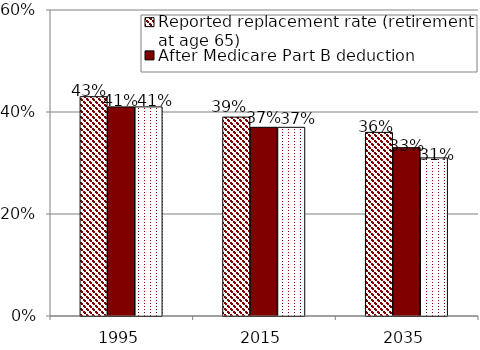
| Category | Reported replacement rate (retirement at age 65) | After Medicare Part B deduction | After personal income taxation |
|---|---|---|---|
| 1995.0 | 0.43 | 0.41 | 0.41 |
| 2015.0 | 0.39 | 0.37 | 0.37 |
| 2035.0 | 0.36 | 0.33 | 0.31 |